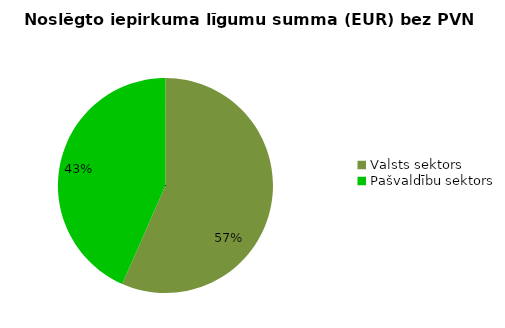
| Category | Noslēgto iepirkuma līgumu summa (EUR) bez PVN |
|---|---|
| Valsts sektors | 12719764 |
| Pašvaldību sektors | 9755855 |